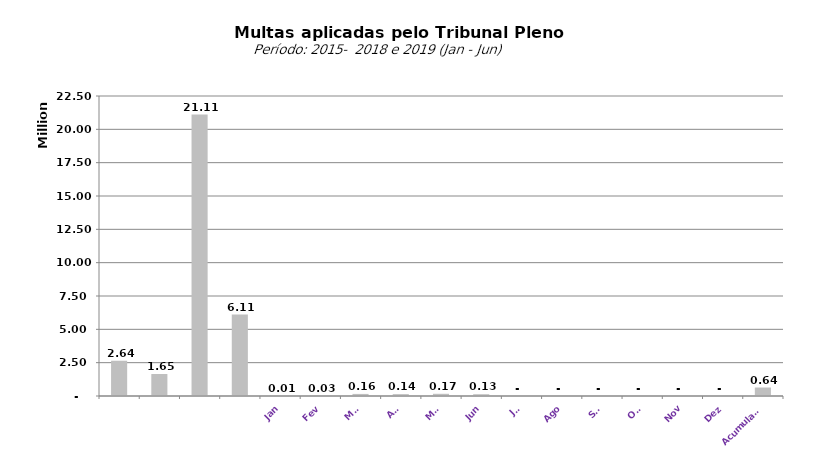
| Category |  1.528.442,62   1.020.189,59   955.160,44   1.276.425,53   2.644.178,81   1.648.289,39   21.112.065,42   6.109.976,68   8.587,38   28.774,76   156.096,39   142.268,21   165.562,13   134.846,46   -     -     -     -     -     -    |
|---|---|
|  | 2644178.81 |
|  | 1648289.39 |
|  | 21112065.42 |
|  | 6109976.68 |
| Jan | 8587.38 |
| Fev | 28774.76 |
| Mar | 156096.39 |
| Abr | 142268.21 |
| Mai | 165562.13 |
| Jun | 134846.46 |
| Jul | 0 |
| Ago | 0 |
| Set | 0 |
| Out | 0 |
| Nov | 0 |
| Dez | 0 |
| Acumulado | 636135.33 |